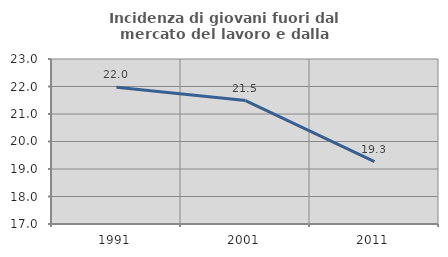
| Category | Incidenza di giovani fuori dal mercato del lavoro e dalla formazione  |
|---|---|
| 1991.0 | 21.969 |
| 2001.0 | 21.49 |
| 2011.0 | 19.266 |